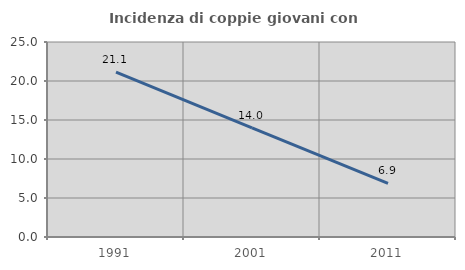
| Category | Incidenza di coppie giovani con figli |
|---|---|
| 1991.0 | 21.141 |
| 2001.0 | 13.987 |
| 2011.0 | 6.869 |